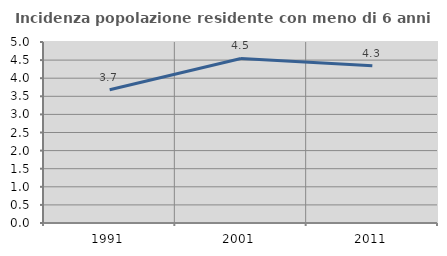
| Category | Incidenza popolazione residente con meno di 6 anni |
|---|---|
| 1991.0 | 3.682 |
| 2001.0 | 4.545 |
| 2011.0 | 4.342 |